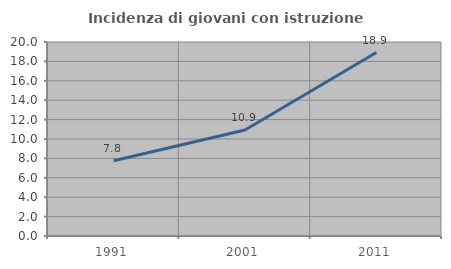
| Category | Incidenza di giovani con istruzione universitaria |
|---|---|
| 1991.0 | 7.763 |
| 2001.0 | 10.935 |
| 2011.0 | 18.915 |